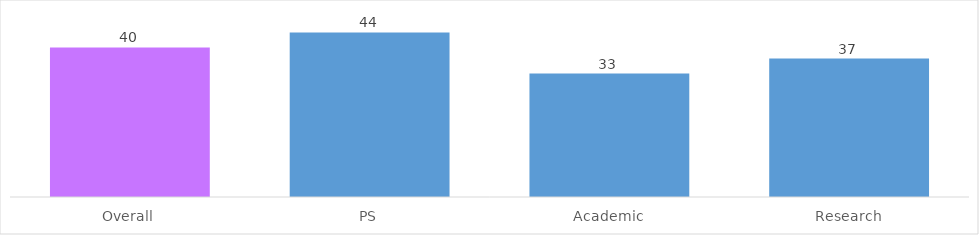
| Category | Series 1 |
|---|---|
| Overall | 40 |
| PS | 44 |
| Academic | 33 |
| Research | 37 |